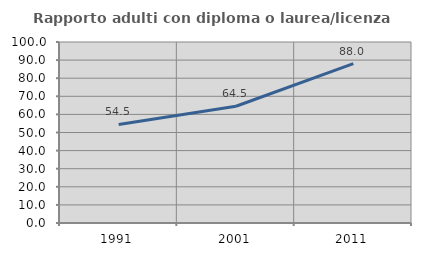
| Category | Rapporto adulti con diploma o laurea/licenza media  |
|---|---|
| 1991.0 | 54.464 |
| 2001.0 | 64.497 |
| 2011.0 | 88.043 |